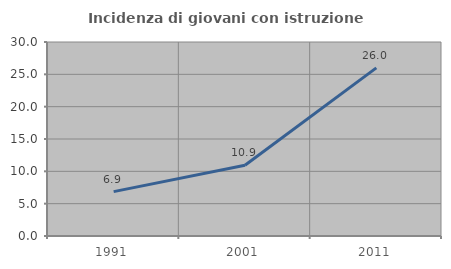
| Category | Incidenza di giovani con istruzione universitaria |
|---|---|
| 1991.0 | 6.863 |
| 2001.0 | 10.949 |
| 2011.0 | 26 |